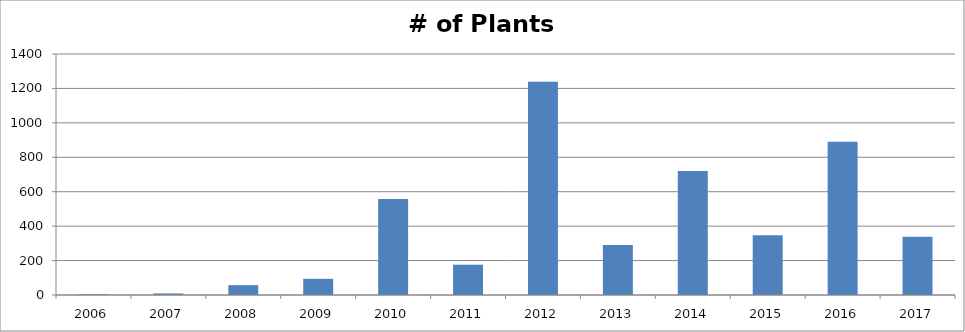
| Category | # of Plants Observed |
|---|---|
| 2006.0 | 4 |
| 2007.0 | 9 |
| 2008.0 | 57 |
| 2009.0 | 94 |
| 2010.0 | 558 |
| 2011.0 | 176 |
| 2012.0 | 1239 |
| 2013.0 | 290 |
| 2014.0 | 720 |
| 2015.0 | 347 |
| 2016.0 | 890 |
| 2017.0 | 339 |